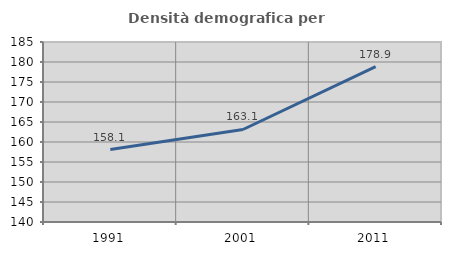
| Category | Densità demografica |
|---|---|
| 1991.0 | 158.106 |
| 2001.0 | 163.126 |
| 2011.0 | 178.868 |